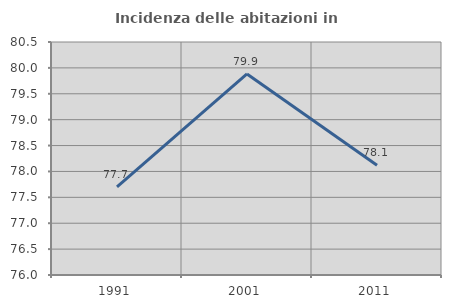
| Category | Incidenza delle abitazioni in proprietà  |
|---|---|
| 1991.0 | 77.701 |
| 2001.0 | 79.884 |
| 2011.0 | 78.118 |